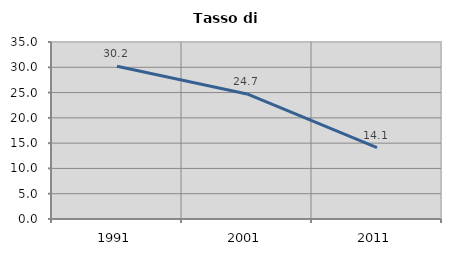
| Category | Tasso di disoccupazione   |
|---|---|
| 1991.0 | 30.218 |
| 2001.0 | 24.728 |
| 2011.0 | 14.117 |